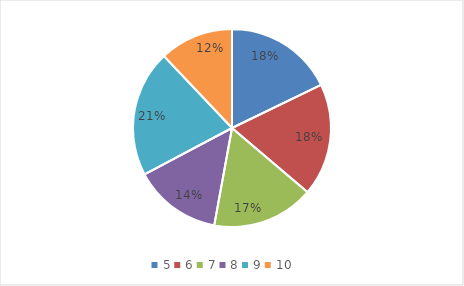
| Category | Series 0 |
|---|---|
| 5.0 | 31 |
| 6.0 | 32 |
| 7.0 | 29 |
| 8.0 | 25 |
| 9.0 | 36 |
| 10.0 | 21 |